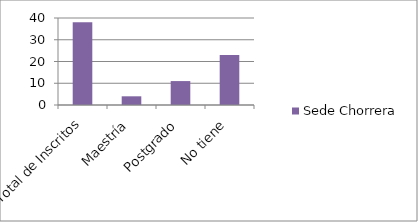
| Category | Sede Chorrera |
|---|---|
| Total de Inscritos | 38 |
| Maestría | 4 |
| Postgrado | 11 |
| No tiene | 23 |